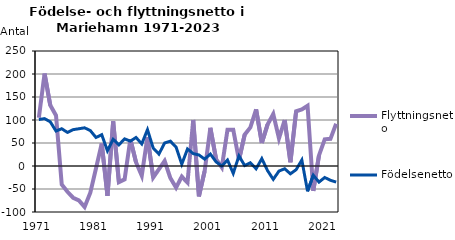
| Category | Flyttningsnetto | Födelsenetto |
|---|---|---|
| 1971 | 105 | 101 |
| 1972 | 201 | 103 |
| 1973 | 132 | 96 |
| 1974 | 110 | 76 |
| 1975 | -40 | 81 |
| 1976 | -56 | 73 |
| 1977 | -69 | 79 |
| 1978 | -75 | 81 |
| 1979 | -89 | 83 |
| 1980 | -58 | 77 |
| 1981 | -5 | 62 |
| 1982 | 49 | 68 |
| 1983 | -65 | 33 |
| 1984 | 97 | 58 |
| 1985 | -35 | 46 |
| 1986 | -29 | 59 |
| 1987 | 58 | 54 |
| 1988 | 8 | 62 |
| 1989 | -21 | 48 |
| 1990 | 63 | 79 |
| 1991 | -25 | 39 |
| 1992 | -7 | 26 |
| 1993 | 11 | 50 |
| 1994 | -26 | 54 |
| 1995 | -47 | 41 |
| 1996 | -23 | 4 |
| 1997 | -36 | 37 |
| 1998 | 100 | 27 |
| 1999 | -66 | 24 |
| 2000 | -11 | 15 |
| 2001 | 83 | 26 |
| 2002 | 15 | 9 |
| 2003 | -3 | 0 |
| 2004 | 79 | 13 |
| 2005 | 79 | -16 |
| 2006 | 13 | 22 |
| 2007 | 68 | 1 |
| 2008 | 84 | 7 |
| 2009 | 123 | -6 |
| 2010 | 50 | 16 |
| 2011 | 90 | -10 |
| 2012 | 113 | -29 |
| 2013 | 60 | -11 |
| 2014 | 100 | -6 |
| 2015 | 8 | -17 |
| 2016 | 119 | -8 |
| 2017 | 123 | 13 |
| 2018 | 131 | -55 |
| 2019 | -54 | -20 |
| 2020 | 23 | -35 |
| 2021 | 58 | -25 |
| 2022 | 59 | -31 |
| 2023 | 92 | -35 |